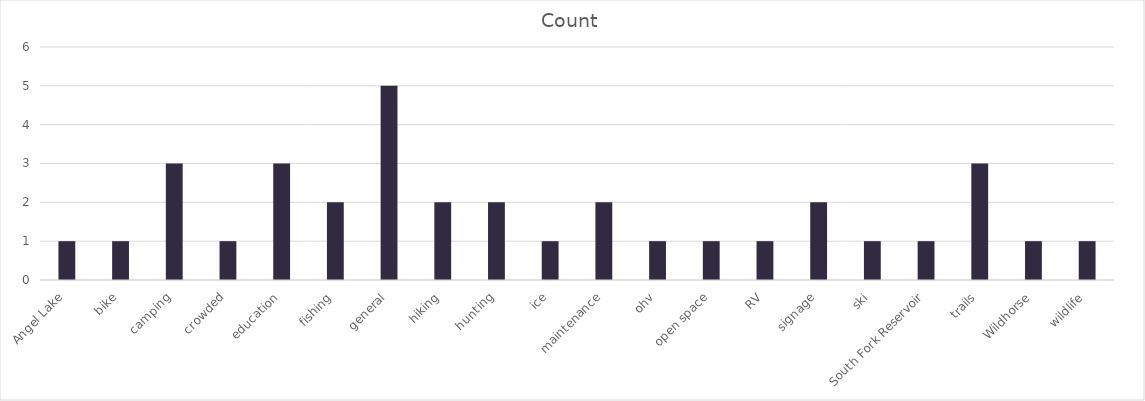
| Category | Count |
|---|---|
| Angel Lake | 1 |
| bike | 1 |
| camping | 3 |
| crowded | 1 |
| education | 3 |
| fishing | 2 |
| general | 5 |
| hiking | 2 |
| hunting | 2 |
| ice | 1 |
| maintenance | 2 |
| ohv | 1 |
| open space | 1 |
| RV | 1 |
| signage | 2 |
| ski | 1 |
| South Fork Reservoir | 1 |
| trails | 3 |
| Wildhorse | 1 |
| wildlife | 1 |